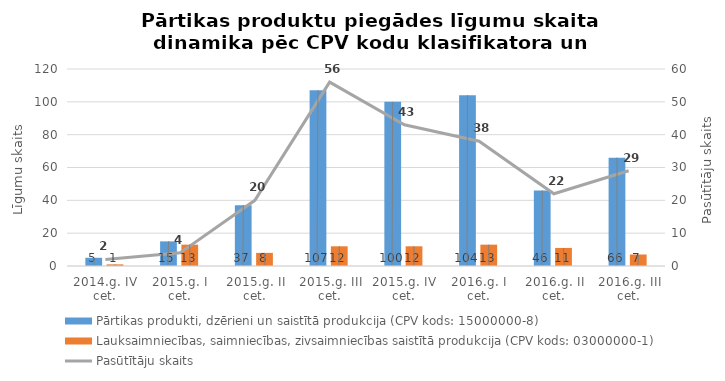
| Category | Pārtikas produkti, dzērieni un saistītā produkcija (CPV kods: 15000000-8) | Lauksaimniecības, saimniecības, zivsaimniecības saistītā produkcija (CPV kods: 03000000-1) |
|---|---|---|
| 2014.g. IV cet. | 5 | 1 |
| 2015.g. I cet. | 15 | 13 |
| 2015.g. II cet. | 37 | 8 |
| 2015.g. III cet. | 107 | 12 |
| 2015.g. IV cet. | 100 | 12 |
| 2016.g. I cet. | 104 | 13 |
| 2016.g. II cet. | 46 | 11 |
| 2016.g. III cet. | 66 | 7 |